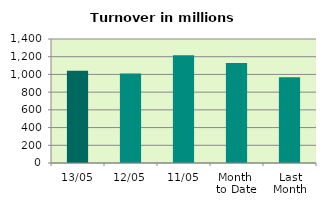
| Category | Series 0 |
|---|---|
| 13/05 | 1042.291 |
| 12/05 | 1010.255 |
| 11/05 | 1215.546 |
| Month 
to Date | 1128.318 |
| Last
Month | 968.247 |